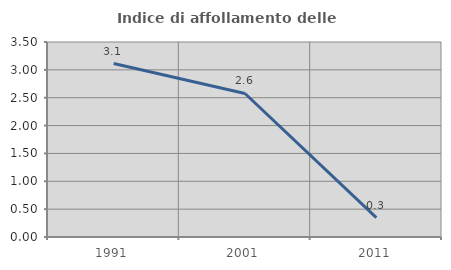
| Category | Indice di affollamento delle abitazioni  |
|---|---|
| 1991.0 | 3.113 |
| 2001.0 | 2.576 |
| 2011.0 | 0.348 |